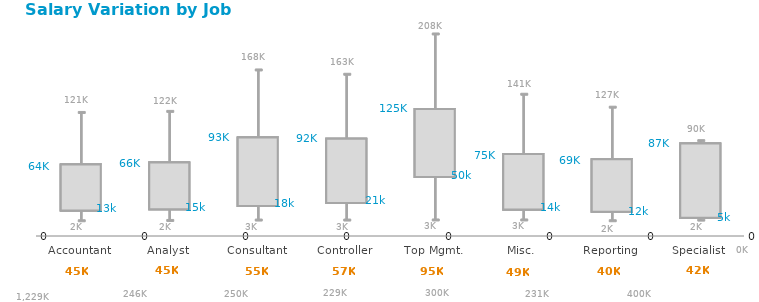
| Category | 25th PCTL | Min | Median | Max | 75th PCTL |
|---|---|---|---|---|---|
| Accountant | 13100 | 1784 | 45000 | 121062 | 63808 |
| Analyst | 14500 | 2137 | 45000 | 122250 | 66000 |
| Consultant | 18042 | 2565 | 54848.5 | 167869 | 93389 |
| Controller | 21370 | 2565 | 57168 | 163113 | 92000 |
| Top Mgmt. | 50000 | 2672 | 95000 | 207500 | 125000 |
| Misc. | 14185.25 | 2672 | 49431 | 141112.125 | 75306 |
| Reporting | 11576 | 1806 | 40000 | 126861.25 | 69483.5 |
| Specialist | 5000 | 2494 | 41713 | 90000 | 87000 |